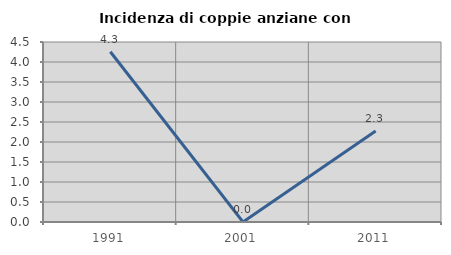
| Category | Incidenza di coppie anziane con figli |
|---|---|
| 1991.0 | 4.255 |
| 2001.0 | 0 |
| 2011.0 | 2.273 |